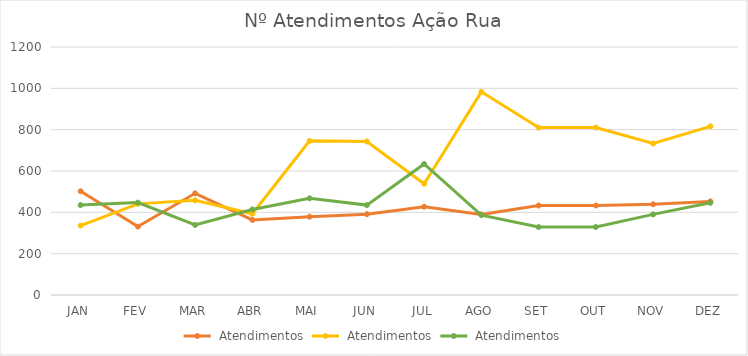
| Category | Lomba | Leste | Partenom |
|---|---|---|---|
| JAN | 502 | 336 | 435 |
| FEV | 331 | 441 | 447 |
| MAR | 492 | 458 | 339 |
| ABR | 363 | 393 | 414 |
| MAI | 379 | 746 | 468 |
| JUN | 391 | 743 | 435 |
| JUL | 427 | 538 | 634 |
| AGO | 390 | 983 | 386 |
| SET | 433 | 810 | 329 |
| OUT | 433 | 810 | 329 |
| NOV | 439 | 733 | 390 |
| DEZ | 453 | 816 | 446 |